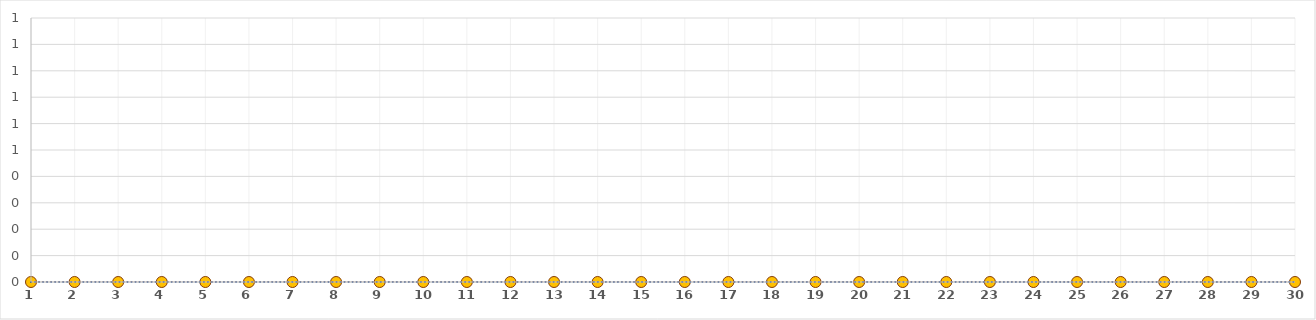
| Category | Series 0 |
|---|---|
| 1.0 | 0 |
| 2.0 | 0 |
| 3.0 | 0 |
| 4.0 | 0 |
| 5.0 | 0 |
| 6.0 | 0 |
| 7.0 | 0 |
| 8.0 | 0 |
| 9.0 | 0 |
| 10.0 | 0 |
| 11.0 | 0 |
| 12.0 | 0 |
| 13.0 | 0 |
| 14.0 | 0 |
| 15.0 | 0 |
| 16.0 | 0 |
| 17.0 | 0 |
| 18.0 | 0 |
| 19.0 | 0 |
| 20.0 | 0 |
| 21.0 | 0 |
| 22.0 | 0 |
| 23.0 | 0 |
| 24.0 | 0 |
| 25.0 | 0 |
| 26.0 | 0 |
| 27.0 | 0 |
| 28.0 | 0 |
| 29.0 | 0 |
| 30.0 | 0 |